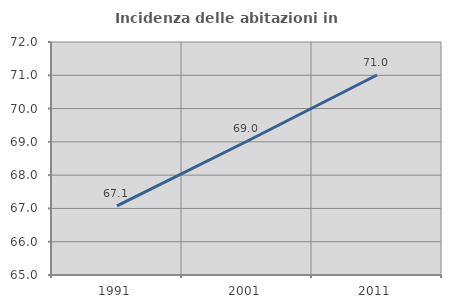
| Category | Incidenza delle abitazioni in proprietà  |
|---|---|
| 1991.0 | 67.076 |
| 2001.0 | 69.019 |
| 2011.0 | 71.008 |